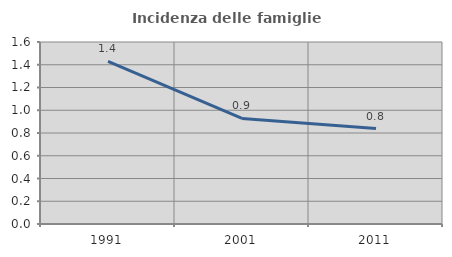
| Category | Incidenza delle famiglie numerose |
|---|---|
| 1991.0 | 1.43 |
| 2001.0 | 0.928 |
| 2011.0 | 0.839 |